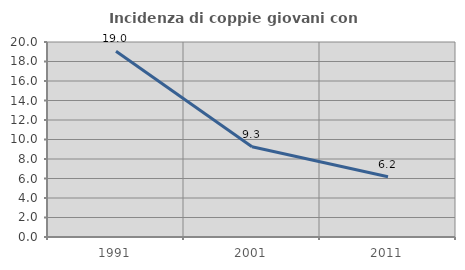
| Category | Incidenza di coppie giovani con figli |
|---|---|
| 1991.0 | 19.048 |
| 2001.0 | 9.263 |
| 2011.0 | 6.186 |